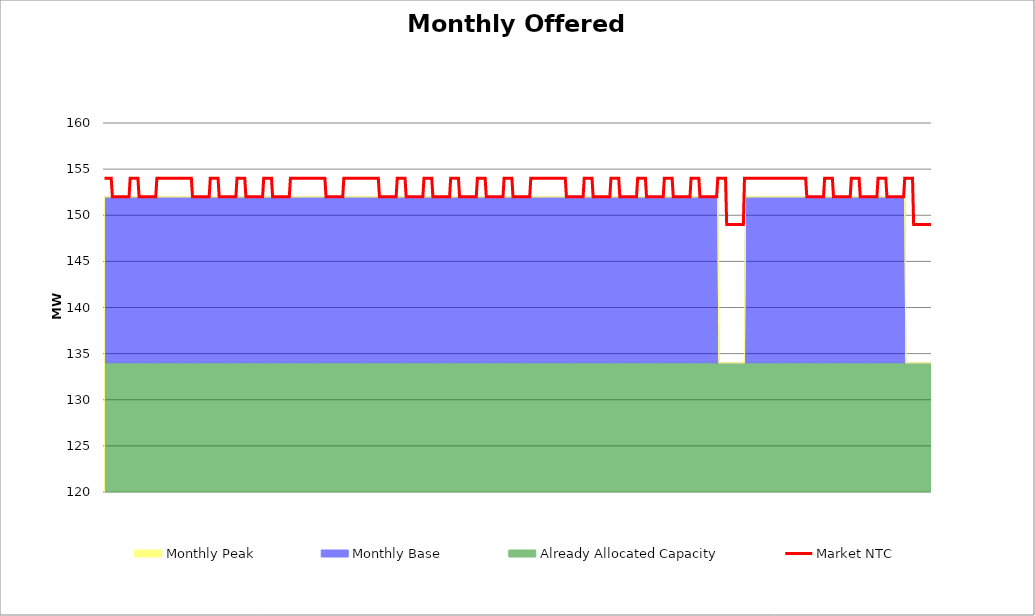
| Category | Market NTC |
|---|---|
| 0 | 154 |
| 1 | 154 |
| 2 | 154 |
| 3 | 154 |
| 4 | 154 |
| 5 | 154 |
| 6 | 154 |
| 7 | 152 |
| 8 | 152 |
| 9 | 152 |
| 10 | 152 |
| 11 | 152 |
| 12 | 152 |
| 13 | 152 |
| 14 | 152 |
| 15 | 152 |
| 16 | 152 |
| 17 | 152 |
| 18 | 152 |
| 19 | 152 |
| 20 | 152 |
| 21 | 152 |
| 22 | 152 |
| 23 | 154 |
| 24 | 154 |
| 25 | 154 |
| 26 | 154 |
| 27 | 154 |
| 28 | 154 |
| 29 | 154 |
| 30 | 154 |
| 31 | 152 |
| 32 | 152 |
| 33 | 152 |
| 34 | 152 |
| 35 | 152 |
| 36 | 152 |
| 37 | 152 |
| 38 | 152 |
| 39 | 152 |
| 40 | 152 |
| 41 | 152 |
| 42 | 152 |
| 43 | 152 |
| 44 | 152 |
| 45 | 152 |
| 46 | 152 |
| 47 | 154 |
| 48 | 154 |
| 49 | 154 |
| 50 | 154 |
| 51 | 154 |
| 52 | 154 |
| 53 | 154 |
| 54 | 154 |
| 55 | 154 |
| 56 | 154 |
| 57 | 154 |
| 58 | 154 |
| 59 | 154 |
| 60 | 154 |
| 61 | 154 |
| 62 | 154 |
| 63 | 154 |
| 64 | 154 |
| 65 | 154 |
| 66 | 154 |
| 67 | 154 |
| 68 | 154 |
| 69 | 154 |
| 70 | 154 |
| 71 | 154 |
| 72 | 154 |
| 73 | 154 |
| 74 | 154 |
| 75 | 154 |
| 76 | 154 |
| 77 | 154 |
| 78 | 154 |
| 79 | 152 |
| 80 | 152 |
| 81 | 152 |
| 82 | 152 |
| 83 | 152 |
| 84 | 152 |
| 85 | 152 |
| 86 | 152 |
| 87 | 152 |
| 88 | 152 |
| 89 | 152 |
| 90 | 152 |
| 91 | 152 |
| 92 | 152 |
| 93 | 152 |
| 94 | 152 |
| 95 | 154 |
| 96 | 154 |
| 97 | 154 |
| 98 | 154 |
| 99 | 154 |
| 100 | 154 |
| 101 | 154 |
| 102 | 154 |
| 103 | 152 |
| 104 | 152 |
| 105 | 152 |
| 106 | 152 |
| 107 | 152 |
| 108 | 152 |
| 109 | 152 |
| 110 | 152 |
| 111 | 152 |
| 112 | 152 |
| 113 | 152 |
| 114 | 152 |
| 115 | 152 |
| 116 | 152 |
| 117 | 152 |
| 118 | 152 |
| 119 | 154 |
| 120 | 154 |
| 121 | 154 |
| 122 | 154 |
| 123 | 154 |
| 124 | 154 |
| 125 | 154 |
| 126 | 154 |
| 127 | 152 |
| 128 | 152 |
| 129 | 152 |
| 130 | 152 |
| 131 | 152 |
| 132 | 152 |
| 133 | 152 |
| 134 | 152 |
| 135 | 152 |
| 136 | 152 |
| 137 | 152 |
| 138 | 152 |
| 139 | 152 |
| 140 | 152 |
| 141 | 152 |
| 142 | 152 |
| 143 | 154 |
| 144 | 154 |
| 145 | 154 |
| 146 | 154 |
| 147 | 154 |
| 148 | 154 |
| 149 | 154 |
| 150 | 154 |
| 151 | 152 |
| 152 | 152 |
| 153 | 152 |
| 154 | 152 |
| 155 | 152 |
| 156 | 152 |
| 157 | 152 |
| 158 | 152 |
| 159 | 152 |
| 160 | 152 |
| 161 | 152 |
| 162 | 152 |
| 163 | 152 |
| 164 | 152 |
| 165 | 152 |
| 166 | 152 |
| 167 | 154 |
| 168 | 154 |
| 169 | 154 |
| 170 | 154 |
| 171 | 154 |
| 172 | 154 |
| 173 | 154 |
| 174 | 154 |
| 175 | 154 |
| 176 | 154 |
| 177 | 154 |
| 178 | 154 |
| 179 | 154 |
| 180 | 154 |
| 181 | 154 |
| 182 | 154 |
| 183 | 154 |
| 184 | 154 |
| 185 | 154 |
| 186 | 154 |
| 187 | 154 |
| 188 | 154 |
| 189 | 154 |
| 190 | 154 |
| 191 | 154 |
| 192 | 154 |
| 193 | 154 |
| 194 | 154 |
| 195 | 154 |
| 196 | 154 |
| 197 | 154 |
| 198 | 154 |
| 199 | 152 |
| 200 | 152 |
| 201 | 152 |
| 202 | 152 |
| 203 | 152 |
| 204 | 152 |
| 205 | 152 |
| 206 | 152 |
| 207 | 152 |
| 208 | 152 |
| 209 | 152 |
| 210 | 152 |
| 211 | 152 |
| 212 | 152 |
| 213 | 152 |
| 214 | 152 |
| 215 | 154 |
| 216 | 154 |
| 217 | 154 |
| 218 | 154 |
| 219 | 154 |
| 220 | 154 |
| 221 | 154 |
| 222 | 154 |
| 223 | 154 |
| 224 | 154 |
| 225 | 154 |
| 226 | 154 |
| 227 | 154 |
| 228 | 154 |
| 229 | 154 |
| 230 | 154 |
| 231 | 154 |
| 232 | 154 |
| 233 | 154 |
| 234 | 154 |
| 235 | 154 |
| 236 | 154 |
| 237 | 154 |
| 238 | 154 |
| 239 | 154 |
| 240 | 154 |
| 241 | 154 |
| 242 | 154 |
| 243 | 154 |
| 244 | 154 |
| 245 | 154 |
| 246 | 154 |
| 247 | 152 |
| 248 | 152 |
| 249 | 152 |
| 250 | 152 |
| 251 | 152 |
| 252 | 152 |
| 253 | 152 |
| 254 | 152 |
| 255 | 152 |
| 256 | 152 |
| 257 | 152 |
| 258 | 152 |
| 259 | 152 |
| 260 | 152 |
| 261 | 152 |
| 262 | 152 |
| 263 | 154 |
| 264 | 154 |
| 265 | 154 |
| 266 | 154 |
| 267 | 154 |
| 268 | 154 |
| 269 | 154 |
| 270 | 154 |
| 271 | 152 |
| 272 | 152 |
| 273 | 152 |
| 274 | 152 |
| 275 | 152 |
| 276 | 152 |
| 277 | 152 |
| 278 | 152 |
| 279 | 152 |
| 280 | 152 |
| 281 | 152 |
| 282 | 152 |
| 283 | 152 |
| 284 | 152 |
| 285 | 152 |
| 286 | 152 |
| 287 | 154 |
| 288 | 154 |
| 289 | 154 |
| 290 | 154 |
| 291 | 154 |
| 292 | 154 |
| 293 | 154 |
| 294 | 154 |
| 295 | 152 |
| 296 | 152 |
| 297 | 152 |
| 298 | 152 |
| 299 | 152 |
| 300 | 152 |
| 301 | 152 |
| 302 | 152 |
| 303 | 152 |
| 304 | 152 |
| 305 | 152 |
| 306 | 152 |
| 307 | 152 |
| 308 | 152 |
| 309 | 152 |
| 310 | 152 |
| 311 | 154 |
| 312 | 154 |
| 313 | 154 |
| 314 | 154 |
| 315 | 154 |
| 316 | 154 |
| 317 | 154 |
| 318 | 154 |
| 319 | 152 |
| 320 | 152 |
| 321 | 152 |
| 322 | 152 |
| 323 | 152 |
| 324 | 152 |
| 325 | 152 |
| 326 | 152 |
| 327 | 152 |
| 328 | 152 |
| 329 | 152 |
| 330 | 152 |
| 331 | 152 |
| 332 | 152 |
| 333 | 152 |
| 334 | 152 |
| 335 | 154 |
| 336 | 154 |
| 337 | 154 |
| 338 | 154 |
| 339 | 154 |
| 340 | 154 |
| 341 | 154 |
| 342 | 154 |
| 343 | 152 |
| 344 | 152 |
| 345 | 152 |
| 346 | 152 |
| 347 | 152 |
| 348 | 152 |
| 349 | 152 |
| 350 | 152 |
| 351 | 152 |
| 352 | 152 |
| 353 | 152 |
| 354 | 152 |
| 355 | 152 |
| 356 | 152 |
| 357 | 152 |
| 358 | 152 |
| 359 | 154 |
| 360 | 154 |
| 361 | 154 |
| 362 | 154 |
| 363 | 154 |
| 364 | 154 |
| 365 | 154 |
| 366 | 154 |
| 367 | 152 |
| 368 | 152 |
| 369 | 152 |
| 370 | 152 |
| 371 | 152 |
| 372 | 152 |
| 373 | 152 |
| 374 | 152 |
| 375 | 152 |
| 376 | 152 |
| 377 | 152 |
| 378 | 152 |
| 379 | 152 |
| 380 | 152 |
| 381 | 152 |
| 382 | 152 |
| 383 | 154 |
| 384 | 154 |
| 385 | 154 |
| 386 | 154 |
| 387 | 154 |
| 388 | 154 |
| 389 | 154 |
| 390 | 154 |
| 391 | 154 |
| 392 | 154 |
| 393 | 154 |
| 394 | 154 |
| 395 | 154 |
| 396 | 154 |
| 397 | 154 |
| 398 | 154 |
| 399 | 154 |
| 400 | 154 |
| 401 | 154 |
| 402 | 154 |
| 403 | 154 |
| 404 | 154 |
| 405 | 154 |
| 406 | 154 |
| 407 | 154 |
| 408 | 154 |
| 409 | 154 |
| 410 | 154 |
| 411 | 154 |
| 412 | 154 |
| 413 | 154 |
| 414 | 154 |
| 415 | 152 |
| 416 | 152 |
| 417 | 152 |
| 418 | 152 |
| 419 | 152 |
| 420 | 152 |
| 421 | 152 |
| 422 | 152 |
| 423 | 152 |
| 424 | 152 |
| 425 | 152 |
| 426 | 152 |
| 427 | 152 |
| 428 | 152 |
| 429 | 152 |
| 430 | 152 |
| 431 | 154 |
| 432 | 154 |
| 433 | 154 |
| 434 | 154 |
| 435 | 154 |
| 436 | 154 |
| 437 | 154 |
| 438 | 154 |
| 439 | 152 |
| 440 | 152 |
| 441 | 152 |
| 442 | 152 |
| 443 | 152 |
| 444 | 152 |
| 445 | 152 |
| 446 | 152 |
| 447 | 152 |
| 448 | 152 |
| 449 | 152 |
| 450 | 152 |
| 451 | 152 |
| 452 | 152 |
| 453 | 152 |
| 454 | 152 |
| 455 | 154 |
| 456 | 154 |
| 457 | 154 |
| 458 | 154 |
| 459 | 154 |
| 460 | 154 |
| 461 | 154 |
| 462 | 154 |
| 463 | 152 |
| 464 | 152 |
| 465 | 152 |
| 466 | 152 |
| 467 | 152 |
| 468 | 152 |
| 469 | 152 |
| 470 | 152 |
| 471 | 152 |
| 472 | 152 |
| 473 | 152 |
| 474 | 152 |
| 475 | 152 |
| 476 | 152 |
| 477 | 152 |
| 478 | 152 |
| 479 | 154 |
| 480 | 154 |
| 481 | 154 |
| 482 | 154 |
| 483 | 154 |
| 484 | 154 |
| 485 | 154 |
| 486 | 154 |
| 487 | 152 |
| 488 | 152 |
| 489 | 152 |
| 490 | 152 |
| 491 | 152 |
| 492 | 152 |
| 493 | 152 |
| 494 | 152 |
| 495 | 152 |
| 496 | 152 |
| 497 | 152 |
| 498 | 152 |
| 499 | 152 |
| 500 | 152 |
| 501 | 152 |
| 502 | 152 |
| 503 | 154 |
| 504 | 154 |
| 505 | 154 |
| 506 | 154 |
| 507 | 154 |
| 508 | 154 |
| 509 | 154 |
| 510 | 154 |
| 511 | 152 |
| 512 | 152 |
| 513 | 152 |
| 514 | 152 |
| 515 | 152 |
| 516 | 152 |
| 517 | 152 |
| 518 | 152 |
| 519 | 152 |
| 520 | 152 |
| 521 | 152 |
| 522 | 152 |
| 523 | 152 |
| 524 | 152 |
| 525 | 152 |
| 526 | 152 |
| 527 | 154 |
| 528 | 154 |
| 529 | 154 |
| 530 | 154 |
| 531 | 154 |
| 532 | 154 |
| 533 | 154 |
| 534 | 154 |
| 535 | 152 |
| 536 | 152 |
| 537 | 152 |
| 538 | 152 |
| 539 | 152 |
| 540 | 152 |
| 541 | 152 |
| 542 | 152 |
| 543 | 152 |
| 544 | 152 |
| 545 | 152 |
| 546 | 152 |
| 547 | 152 |
| 548 | 152 |
| 549 | 152 |
| 550 | 152 |
| 551 | 154 |
| 552 | 154 |
| 553 | 154 |
| 554 | 154 |
| 555 | 154 |
| 556 | 154 |
| 557 | 154 |
| 558 | 154 |
| 559 | 149 |
| 560 | 149 |
| 561 | 149 |
| 562 | 149 |
| 563 | 149 |
| 564 | 149 |
| 565 | 149 |
| 566 | 149 |
| 567 | 149 |
| 568 | 149 |
| 569 | 149 |
| 570 | 149 |
| 571 | 149 |
| 572 | 149 |
| 573 | 149 |
| 574 | 149 |
| 575 | 154 |
| 576 | 154 |
| 577 | 154 |
| 578 | 154 |
| 579 | 154 |
| 580 | 154 |
| 581 | 154 |
| 582 | 154 |
| 583 | 154 |
| 584 | 154 |
| 585 | 154 |
| 586 | 154 |
| 587 | 154 |
| 588 | 154 |
| 589 | 154 |
| 590 | 154 |
| 591 | 154 |
| 592 | 154 |
| 593 | 154 |
| 594 | 154 |
| 595 | 154 |
| 596 | 154 |
| 597 | 154 |
| 598 | 154 |
| 599 | 154 |
| 600 | 154 |
| 601 | 154 |
| 602 | 154 |
| 603 | 154 |
| 604 | 154 |
| 605 | 154 |
| 606 | 154 |
| 607 | 154 |
| 608 | 154 |
| 609 | 154 |
| 610 | 154 |
| 611 | 154 |
| 612 | 154 |
| 613 | 154 |
| 614 | 154 |
| 615 | 154 |
| 616 | 154 |
| 617 | 154 |
| 618 | 154 |
| 619 | 154 |
| 620 | 154 |
| 621 | 154 |
| 622 | 154 |
| 623 | 154 |
| 624 | 154 |
| 625 | 154 |
| 626 | 154 |
| 627 | 154 |
| 628 | 154 |
| 629 | 154 |
| 630 | 154 |
| 631 | 152 |
| 632 | 152 |
| 633 | 152 |
| 634 | 152 |
| 635 | 152 |
| 636 | 152 |
| 637 | 152 |
| 638 | 152 |
| 639 | 152 |
| 640 | 152 |
| 641 | 152 |
| 642 | 152 |
| 643 | 152 |
| 644 | 152 |
| 645 | 152 |
| 646 | 152 |
| 647 | 154 |
| 648 | 154 |
| 649 | 154 |
| 650 | 154 |
| 651 | 154 |
| 652 | 154 |
| 653 | 154 |
| 654 | 154 |
| 655 | 152 |
| 656 | 152 |
| 657 | 152 |
| 658 | 152 |
| 659 | 152 |
| 660 | 152 |
| 661 | 152 |
| 662 | 152 |
| 663 | 152 |
| 664 | 152 |
| 665 | 152 |
| 666 | 152 |
| 667 | 152 |
| 668 | 152 |
| 669 | 152 |
| 670 | 152 |
| 671 | 154 |
| 672 | 154 |
| 673 | 154 |
| 674 | 154 |
| 675 | 154 |
| 676 | 154 |
| 677 | 154 |
| 678 | 154 |
| 679 | 152 |
| 680 | 152 |
| 681 | 152 |
| 682 | 152 |
| 683 | 152 |
| 684 | 152 |
| 685 | 152 |
| 686 | 152 |
| 687 | 152 |
| 688 | 152 |
| 689 | 152 |
| 690 | 152 |
| 691 | 152 |
| 692 | 152 |
| 693 | 152 |
| 694 | 152 |
| 695 | 154 |
| 696 | 154 |
| 697 | 154 |
| 698 | 154 |
| 699 | 154 |
| 700 | 154 |
| 701 | 154 |
| 702 | 154 |
| 703 | 152 |
| 704 | 152 |
| 705 | 152 |
| 706 | 152 |
| 707 | 152 |
| 708 | 152 |
| 709 | 152 |
| 710 | 152 |
| 711 | 152 |
| 712 | 152 |
| 713 | 152 |
| 714 | 152 |
| 715 | 152 |
| 716 | 152 |
| 717 | 152 |
| 718 | 152 |
| 719 | 154 |
| 720 | 154 |
| 721 | 154 |
| 722 | 154 |
| 723 | 154 |
| 724 | 154 |
| 725 | 154 |
| 726 | 154 |
| 727 | 149 |
| 728 | 149 |
| 729 | 149 |
| 730 | 149 |
| 731 | 149 |
| 732 | 149 |
| 733 | 149 |
| 734 | 149 |
| 735 | 149 |
| 736 | 149 |
| 737 | 149 |
| 738 | 149 |
| 739 | 149 |
| 740 | 149 |
| 741 | 149 |
| 742 | 149 |
| 743 | 149 |